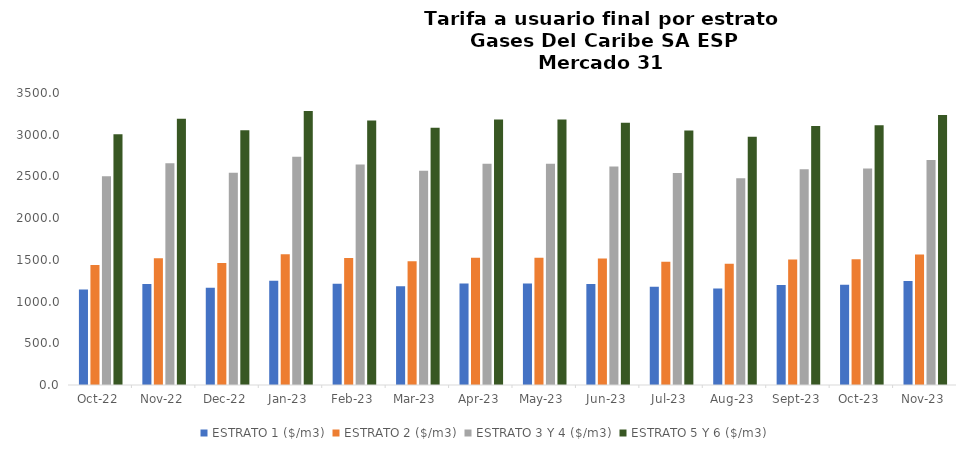
| Category | ESTRATO 1 ($/m3) | ESTRATO 2 ($/m3) | ESTRATO 3 Y 4 ($/m3) | ESTRATO 5 Y 6 ($/m3) |
|---|---|---|---|---|
| 2022-10-01 | 1146.18 | 1437.12 | 2503.54 | 3004.248 |
| 2022-11-01 | 1212.06 | 1519.44 | 2658.31 | 3189.972 |
| 2022-12-01 | 1166.58 | 1463.43 | 2544.24 | 3053.088 |
| 2023-01-01 | 1248.7 | 1565.89 | 2736.03 | 3283.236 |
| 2023-02-01 | 1212.89 | 1521.57 | 2641.83 | 3170.196 |
| 2023-03-01 | 1183.19 | 1482.78 | 2568.94 | 3082.728 |
| 2023-04-01 | 1215.25 | 1524.46 | 2651.33 | 3181.596 |
| 2023-05-01 | 1215.25 | 1524.46 | 2651.33 | 3181.596 |
| 2023-06-01 | 1209.41 | 1517.12 | 2619.03 | 3142.836 |
| 2023-07-01 | 1178 | 1477.97 | 2542.18 | 3050.616 |
| 2023-08-01 | 1155.93 | 1451.92 | 2479.28 | 2975.136 |
| 2023-09-01 | 1198 | 1503.27 | 2586.8 | 3104.16 |
| 2023-10-01 | 1201.13 | 1507.69 | 2594.42 | 3113.304 |
| 2023-11-01 | 1245.69 | 1564.66 | 2697.24 | 3236.688 |